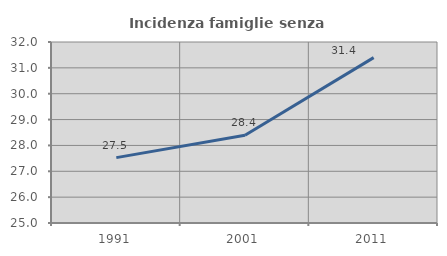
| Category | Incidenza famiglie senza nuclei |
|---|---|
| 1991.0 | 27.528 |
| 2001.0 | 28.395 |
| 2011.0 | 31.395 |